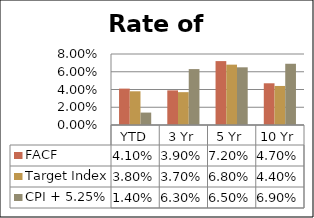
| Category | FACF | Target Index | CPI + 5.25% |
|---|---|---|---|
| YTD | 0.041 | 0.038 | 0.014 |
| 3 Yr | 0.039 | 0.037 | 0.063 |
| 5 Yr | 0.072 | 0.068 | 0.065 |
| 10 Yr | 0.047 | 0.044 | 0.069 |